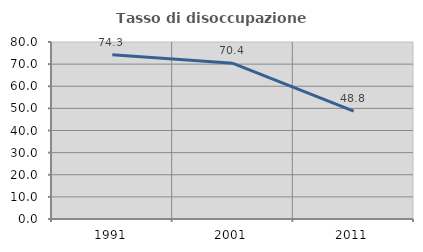
| Category | Tasso di disoccupazione giovanile  |
|---|---|
| 1991.0 | 74.274 |
| 2001.0 | 70.37 |
| 2011.0 | 48.76 |